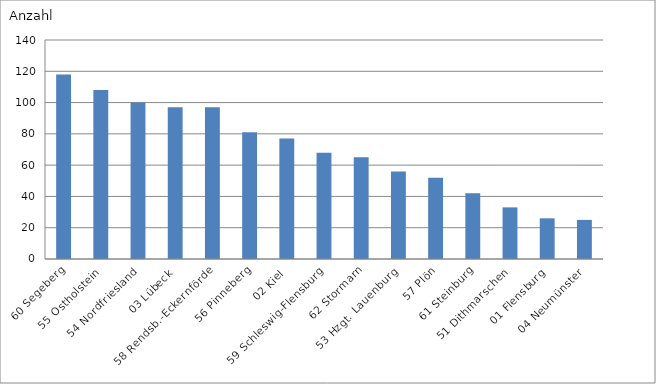
| Category | 60 Segeberg |
|---|---|
| 60 Segeberg | 118 |
| 55 Ostholstein | 108 |
| 54 Nordfriesland | 100 |
| 03 Lübeck | 97 |
| 58 Rendsb.-Eckernförde | 97 |
| 56 Pinneberg | 81 |
| 02 Kiel | 77 |
| 59 Schleswig-Flensburg | 68 |
| 62 Stormarn | 65 |
| 53 Hzgt. Lauenburg | 56 |
| 57 Plön | 52 |
| 61 Steinburg | 42 |
| 51 Dithmarschen | 33 |
| 01 Flensburg | 26 |
| 04 Neumünster | 25 |